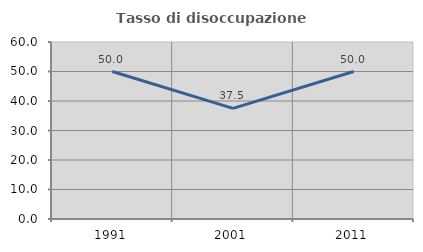
| Category | Tasso di disoccupazione giovanile  |
|---|---|
| 1991.0 | 50 |
| 2001.0 | 37.5 |
| 2011.0 | 50 |